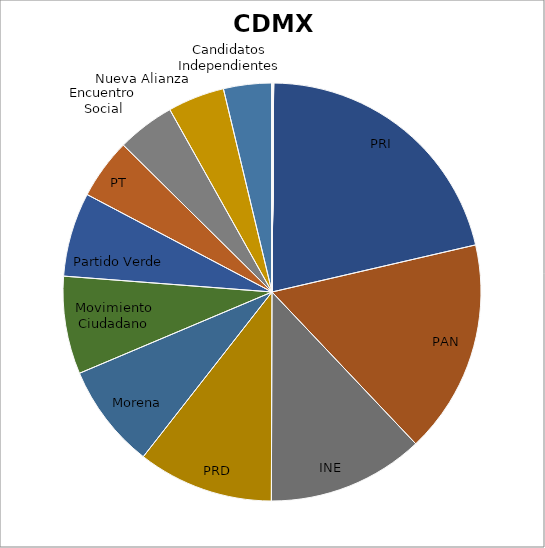
| Category | audiencia |
|---|---|
| PRI | 93787820 |
| PAN | 72597693 |
| INE | 53140636 |
| PRD | 46106429 |
| Morena | 35451570 |
| Movimiento Ciudadano | 33203151 |
| Partido Verde | 28545435 |
| PT | 20548351 |
| Encuentro Social | 19593169 |
| Nueva Alianza | 19265315 |
| Candidatos Independientes | 16388940 |